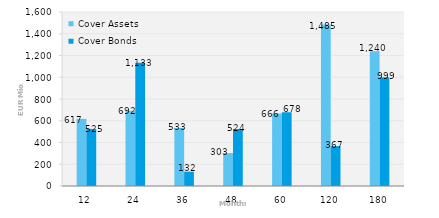
| Category | Cover Assets | Cover Bonds |
|---|---|---|
| 12.0 | 617.232 | 525 |
| 24.0 | 692.027 | 1133.291 |
| 36.0 | 532.676 | 131.519 |
| 48.0 | 302.659 | 524 |
| 60.0 | 665.863 | 678.015 |
| 120.0 | 1484.858 | 366.586 |
| 180.0 | 1240.121 | 999.185 |